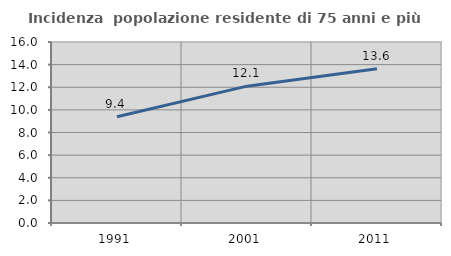
| Category | Incidenza  popolazione residente di 75 anni e più |
|---|---|
| 1991.0 | 9.39 |
| 2001.0 | 12.097 |
| 2011.0 | 13.628 |